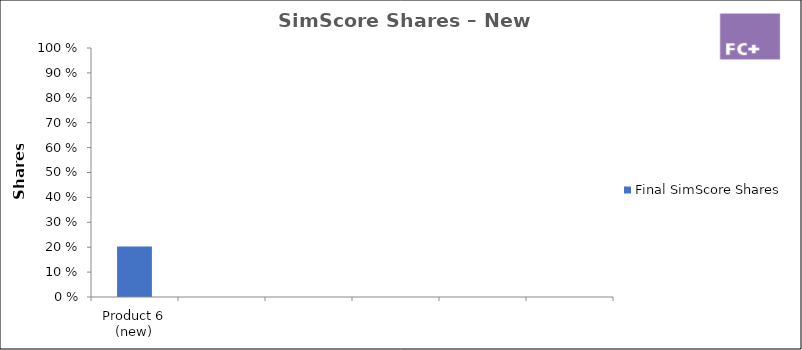
| Category | Final SimScore Shares |
|---|---|
| Product 6 (new) | 0.203 |